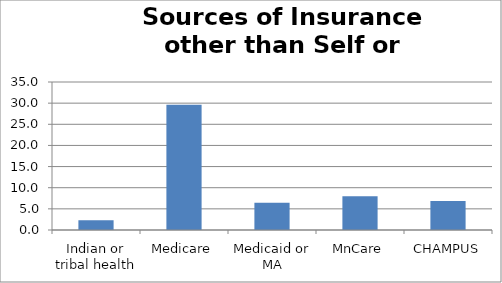
| Category | Series 0 |
|---|---|
| Indian or tribal health | 2.315 |
| Medicare | 29.635 |
| Medicaid or MA | 6.446 |
| MnCare | 7.997 |
| CHAMPUS | 6.843 |